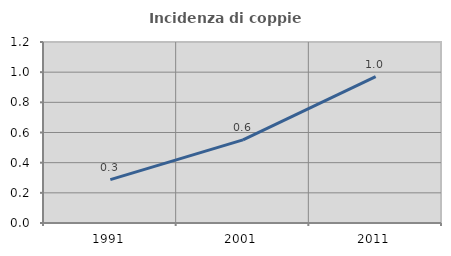
| Category | Incidenza di coppie miste |
|---|---|
| 1991.0 | 0.288 |
| 2001.0 | 0.551 |
| 2011.0 | 0.971 |